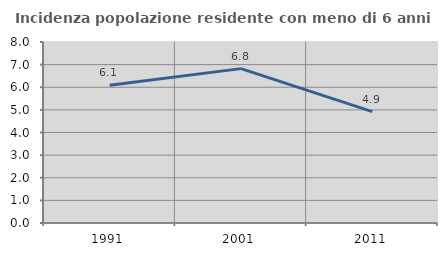
| Category | Incidenza popolazione residente con meno di 6 anni |
|---|---|
| 1991.0 | 6.086 |
| 2001.0 | 6.824 |
| 2011.0 | 4.921 |